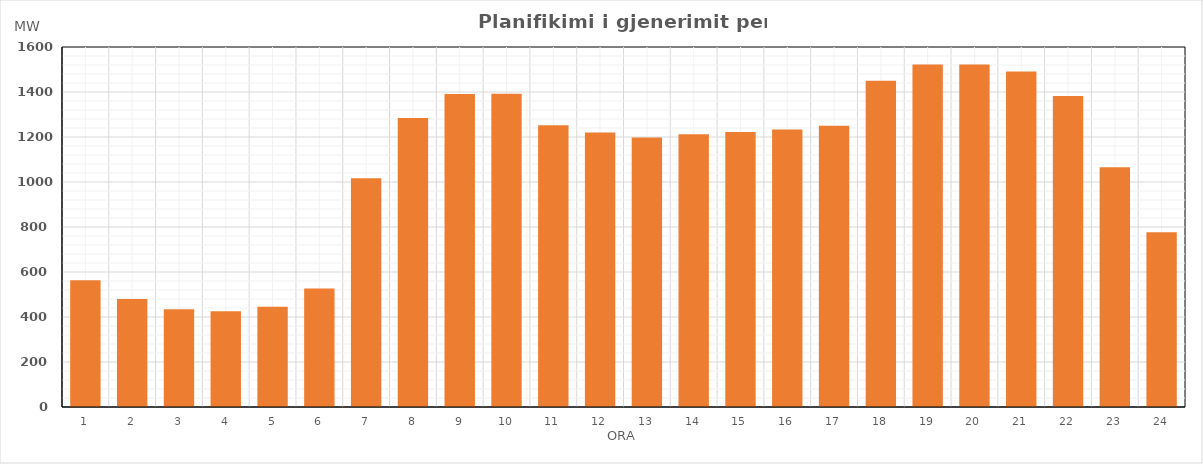
| Category | Max (MW) |
|---|---|
| 0 | 562.8 |
| 1 | 480.22 |
| 2 | 434.22 |
| 3 | 425.02 |
| 4 | 445.22 |
| 5 | 527.22 |
| 6 | 1017.22 |
| 7 | 1284.985 |
| 8 | 1391.64 |
| 9 | 1391.671 |
| 10 | 1252.536 |
| 11 | 1219.491 |
| 12 | 1197.406 |
| 13 | 1212.435 |
| 14 | 1222.395 |
| 15 | 1233.31 |
| 16 | 1250.309 |
| 17 | 1449.88 |
| 18 | 1522.345 |
| 19 | 1522.375 |
| 20 | 1491.26 |
| 21 | 1381.68 |
| 22 | 1065.78 |
| 23 | 776.22 |